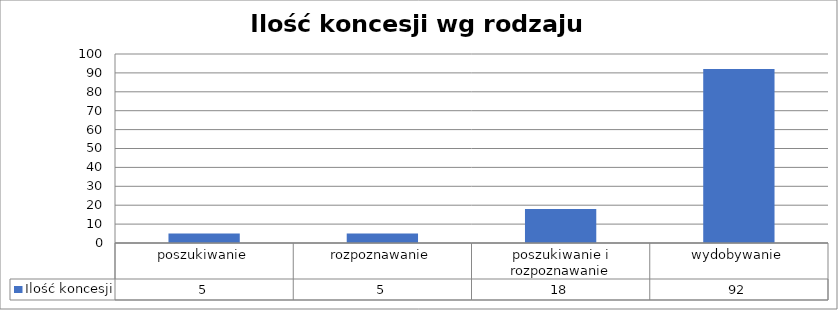
| Category | Ilość koncesji |
|---|---|
| poszukiwanie | 5 |
| rozpoznawanie | 5 |
| poszukiwanie i rozpoznawanie | 18 |
| wydobywanie | 92 |